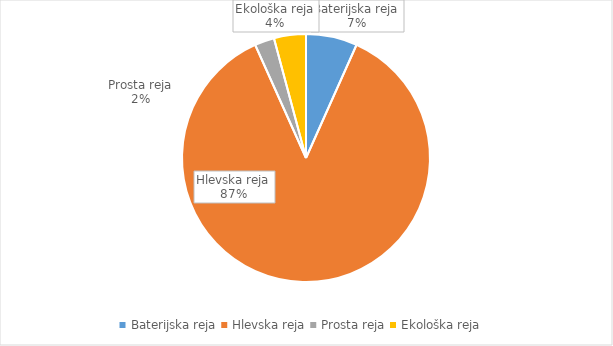
| Category | Količina kosov jajc |
|---|---|
| Baterijska reja | 210710 |
| Hlevska reja | 2729188 |
| Prosta reja | 80634 |
| Ekološka reja | 131260 |